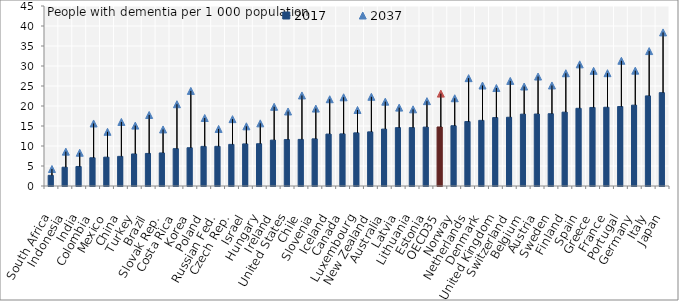
| Category | 2017 |
|---|---|
| South Africa | 2.663 |
| Indonesia | 4.695 |
| India | 4.886 |
| Colombia | 7.059 |
| Mexico | 7.208 |
| China | 7.407 |
| Turkey | 8.012 |
| Brazil | 8.144 |
| Slovak Rep. | 8.265 |
| Costa Rica | 9.338 |
| Korea | 9.565 |
| Poland | 9.907 |
| Russian Fed. | 9.919 |
| Czech Rep. | 10.403 |
| Israel | 10.523 |
| Hungary | 10.567 |
| Ireland | 11.471 |
| United States | 11.608 |
| Chile | 11.65 |
| Slovenia | 11.791 |
| Iceland | 12.979 |
| Canada | 13.032 |
| Luxembourg | 13.286 |
| New Zealand | 13.535 |
| Australia | 14.223 |
| Latvia | 14.589 |
| Lithuania | 14.595 |
| Estonia | 14.719 |
| OECD35 | 14.754 |
| Norway | 15.068 |
| Netherlands | 16.116 |
| Denmark | 16.41 |
| United Kingdom | 17.106 |
| Switzerland | 17.186 |
| Belgium | 17.964 |
| Austria | 17.993 |
| Sweden | 18.071 |
| Finland | 18.463 |
| Spain | 19.424 |
| Greece | 19.636 |
| France | 19.684 |
| Portugal | 19.875 |
| Germany | 20.213 |
| Italy | 22.524 |
| Japan | 23.333 |